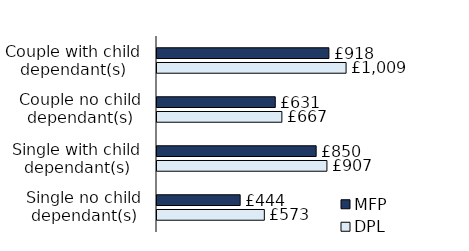
| Category | DPL | MFP |
|---|---|---|
| Single no child dependant(s) | 572.98 | 443.97 |
| Single with child dependant(s) | 907.09 | 849.61 |
| Couple no child dependant(s) | 666.53 | 631.36 |
| Couple with child dependant(s) | 1009.34 | 917.58 |